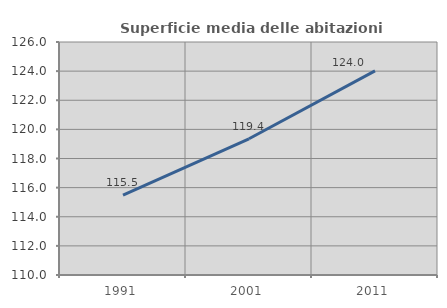
| Category | Superficie media delle abitazioni occupate |
|---|---|
| 1991.0 | 115.481 |
| 2001.0 | 119.356 |
| 2011.0 | 124.019 |